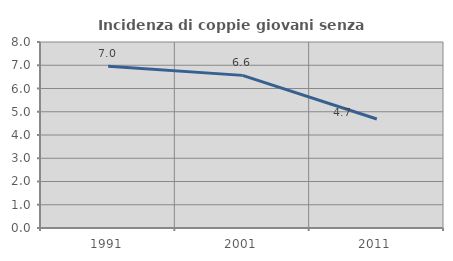
| Category | Incidenza di coppie giovani senza figli |
|---|---|
| 1991.0 | 6.952 |
| 2001.0 | 6.565 |
| 2011.0 | 4.688 |